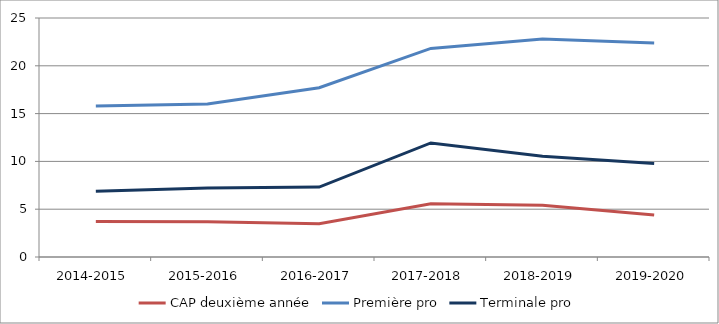
| Category | CAP deuxième année | Première pro | Terminale pro |
|---|---|---|---|
| 2014-2015 | 3.72 | 15.8 | 6.89 |
| 2015-2016 | 3.69 | 16.01 | 7.21 |
| 2016-2017 | 3.47 | 17.71 | 7.32 |
| 2017-2018 | 5.56 | 21.82 | 11.93 |
| 2018-2019 | 5.41 | 22.81 | 10.53 |
| 2019-2020 | 4.4 | 22.38 | 9.79 |